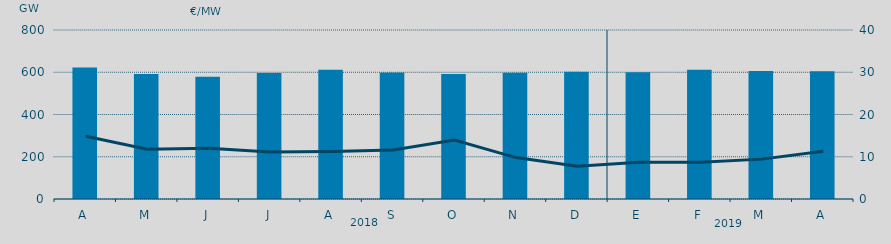
| Category | Energia (MWh) a subir |
|---|---|
| A | 622.901 |
| M | 591.481 |
| J | 578.107 |
| J | 596.766 |
| A | 612.087 |
| S | 599.215 |
| O | 591.968 |
| N | 597.847 |
| D | 602.253 |
| E | 600.235 |
| F | 612.121 |
| M | 605.978 |
| A | 604.29 |